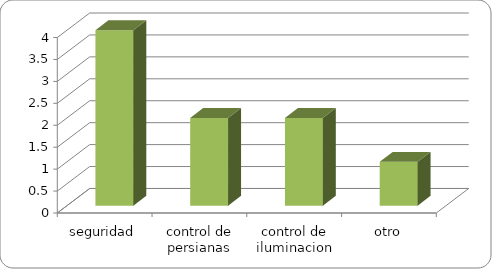
| Category | Series 0 |
|---|---|
| seguridad | 4 |
| control de persianas | 2 |
| control de iluminacion | 2 |
| otro | 1 |